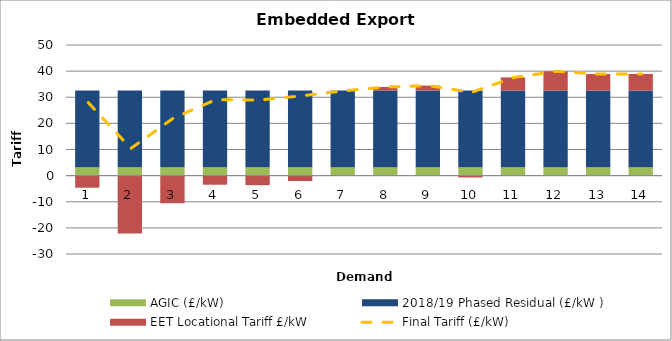
| Category | AGIC (£/kW) | 2018/19 Phased Residual (£/kW ) | EET Locational Tariff £/kW |
|---|---|---|---|
| 0 | 3.22 | 29.36 | -4.622 |
| 1 | 3.22 | 29.36 | -22.178 |
| 2 | 3.22 | 29.36 | -10.553 |
| 3 | 3.22 | 29.36 | -3.476 |
| 4 | 3.22 | 29.36 | -3.663 |
| 5 | 3.22 | 29.36 | -2.062 |
| 6 | 3.22 | 29.36 | -0.105 |
| 7 | 3.22 | 29.36 | 1.353 |
| 8 | 3.22 | 29.36 | 1.872 |
| 9 | 3.22 | 29.36 | -0.715 |
| 10 | 3.22 | 29.36 | 5.02 |
| 11 | 3.22 | 29.36 | 7.343 |
| 12 | 3.22 | 29.36 | 6.303 |
| 13 | 3.22 | 29.36 | 6.364 |